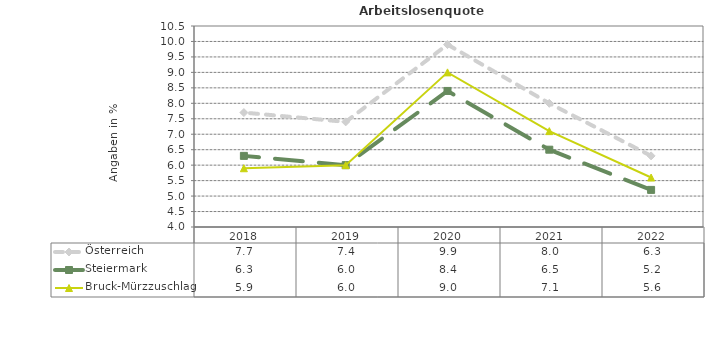
| Category | Österreich | Steiermark | Bruck-Mürzzuschlag |
|---|---|---|---|
| 2022.0 | 6.3 | 5.2 | 5.6 |
| 2021.0 | 8 | 6.5 | 7.1 |
| 2020.0 | 9.9 | 8.4 | 9 |
| 2019.0 | 7.4 | 6 | 6 |
| 2018.0 | 7.7 | 6.3 | 5.9 |